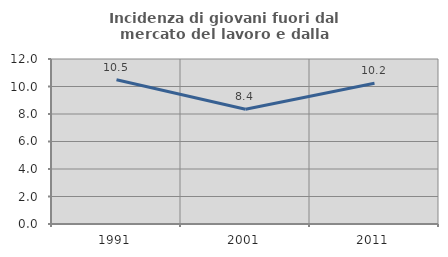
| Category | Incidenza di giovani fuori dal mercato del lavoro e dalla formazione  |
|---|---|
| 1991.0 | 10.49 |
| 2001.0 | 8.351 |
| 2011.0 | 10.236 |